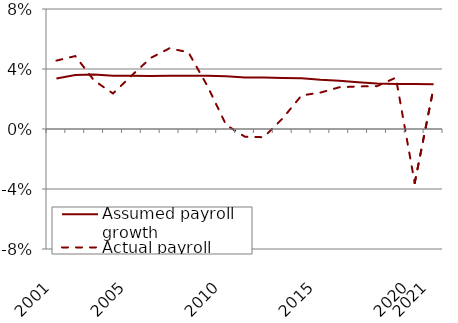
| Category | Assumed payroll growth | Actual payroll growth |
|---|---|---|
| 2001.0 | 0.034 | 0.046 |
| nan | 0.036 | 0.049 |
| nan | 0.036 | 0.032 |
| nan | 0.035 | 0.024 |
| 2005.0 | 0.035 | 0.036 |
| nan | 0.035 | 0.047 |
| nan | 0.036 | 0.054 |
| nan | 0.035 | 0.051 |
| nan | 0.036 | 0.029 |
| 2010.0 | 0.035 | 0.003 |
| nan | 0.034 | -0.005 |
| nan | 0.034 | -0.005 |
| nan | 0.034 | 0.007 |
| nan | 0.034 | 0.022 |
| 2015.0 | 0.033 | 0.024 |
| nan | 0.032 | 0.028 |
| nan | 0.031 | 0.028 |
| nan | 0.03 | 0.029 |
| nan | 0.03 | 0.034 |
| 2020.0 | 0.03 | -0.036 |
| 2021.0 | 0.03 | 0.028 |